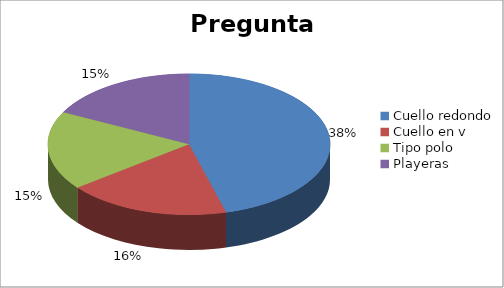
| Category | Series 0 |
|---|---|
| Cuello redondo | 0.38 |
| Cuello en v | 0.155 |
| Tipo polo | 0.15 |
| Playeras | 0.145 |